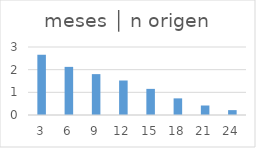
| Category | meses │ n origen |
|---|---|
| 3.0 | 2.658 |
| 6.0 | 2.123 |
| 9.0 | 1.803 |
| 12.0 | 1.522 |
| 15.0 | 1.153 |
| 18.0 | 0.733 |
| 21.0 | 0.419 |
| 24.0 | 0.215 |